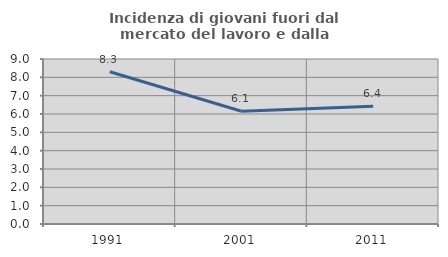
| Category | Incidenza di giovani fuori dal mercato del lavoro e dalla formazione  |
|---|---|
| 1991.0 | 8.308 |
| 2001.0 | 6.148 |
| 2011.0 | 6.417 |